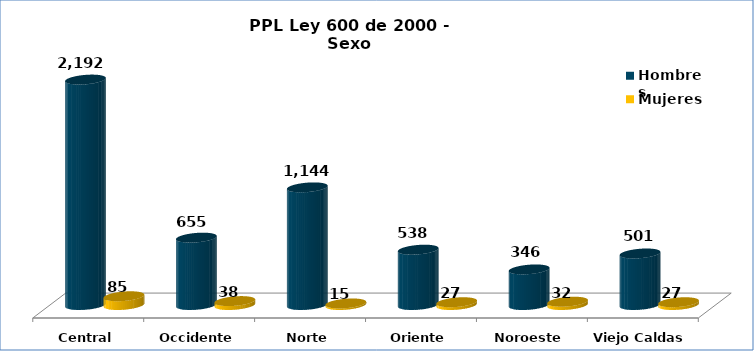
| Category | Hombres | Mujeres |
|---|---|---|
| Central | 2192 | 85 |
| Occidente | 655 | 38 |
| Norte | 1144 | 15 |
| Oriente | 538 | 27 |
| Noroeste | 346 | 32 |
| Viejo Caldas | 501 | 27 |